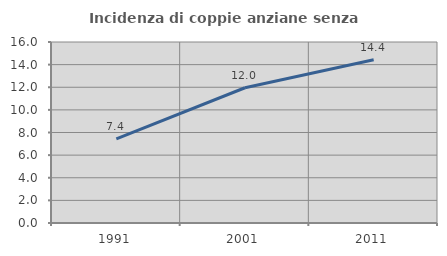
| Category | Incidenza di coppie anziane senza figli  |
|---|---|
| 1991.0 | 7.446 |
| 2001.0 | 11.957 |
| 2011.0 | 14.427 |